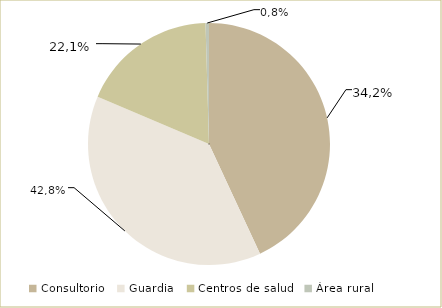
| Category | Series 0 |
|---|---|
| Consultorio | 43.072 |
| Guardia | 38.328 |
| Centros de salud | 18.14 |
| Área rural | 0.46 |